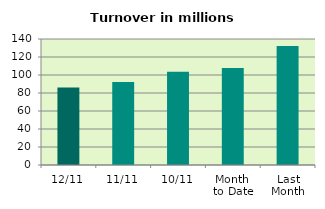
| Category | Series 0 |
|---|---|
| 12/11 | 86.022 |
| 11/11 | 92.138 |
| 10/11 | 103.609 |
| Month 
to Date | 107.666 |
| Last
Month | 132.268 |